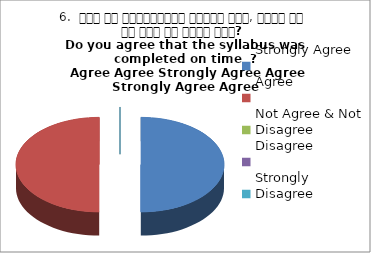
| Category | 6.  समय पर पाठ्यक्रम पूर्ण हुआ, क्या आप इस बात से सहमत हैं? 
Do you agree that the syllabus was completed on time  ?
 Agree Agree Strongly Agree Agree Strongly Agree Agree |
|---|---|
| Strongly Agree | 2 |
| Agree | 2 |
| Not Agree & Not Disagree | 0 |
| Disagree | 0 |
| Strongly Disagree | 0 |